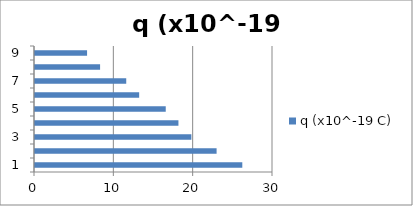
| Category | q (x10^-19 C) |
|---|---|
| 0 | 26.13 |
| 1 | 22.89 |
| 2 | 19.71 |
| 3 | 18.08 |
| 4 | 16.48 |
| 5 | 13.13 |
| 6 | 11.5 |
| 7 | 8.204 |
| 8 | 6.563 |